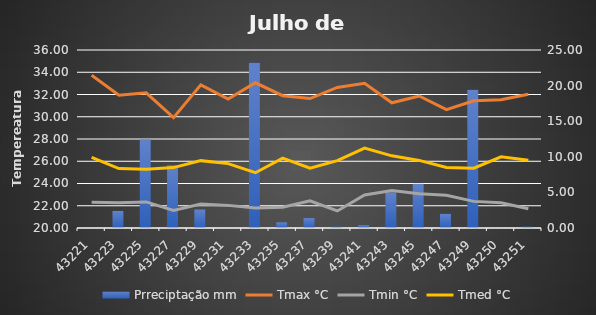
| Category | Prreciptação |
|---|---|
| 5/1/18 | 0 |
| 5/3/18 | 2.4 |
| 5/5/18 | 12.4 |
| 5/7/18 | 8.8 |
| 5/9/18 | 2.6 |
| 5/11/18 | 0 |
| 5/13/18 | 23.2 |
| 5/15/18 | 0.8 |
| 5/17/18 | 1.4 |
| 5/19/18 | 0.2 |
| 5/21/18 | 0.4 |
| 5/23/18 | 5 |
| 5/25/18 | 6.2 |
| 5/27/18 | 2 |
| 5/29/18 | 19.4 |
| 5/30/18 | 0 |
| 5/31/18 | 0.2 |